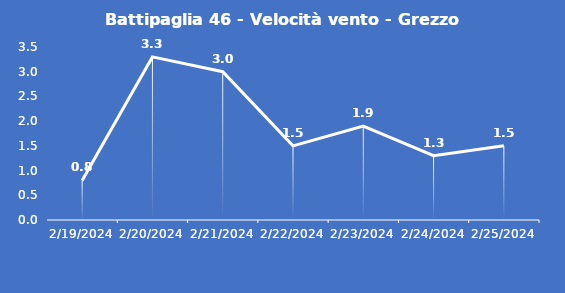
| Category | Battipaglia 46 - Velocità vento - Grezzo (m/s) |
|---|---|
| 2/19/24 | 0.8 |
| 2/20/24 | 3.3 |
| 2/21/24 | 3 |
| 2/22/24 | 1.5 |
| 2/23/24 | 1.9 |
| 2/24/24 | 1.3 |
| 2/25/24 | 1.5 |